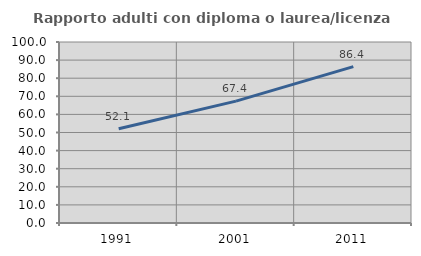
| Category | Rapporto adulti con diploma o laurea/licenza media  |
|---|---|
| 1991.0 | 52.064 |
| 2001.0 | 67.352 |
| 2011.0 | 86.391 |